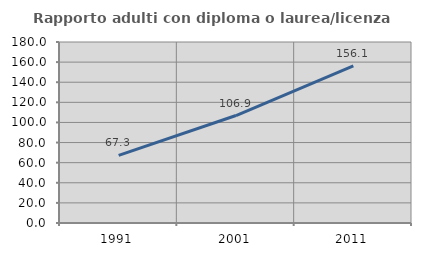
| Category | Rapporto adulti con diploma o laurea/licenza media  |
|---|---|
| 1991.0 | 67.251 |
| 2001.0 | 106.897 |
| 2011.0 | 156.15 |